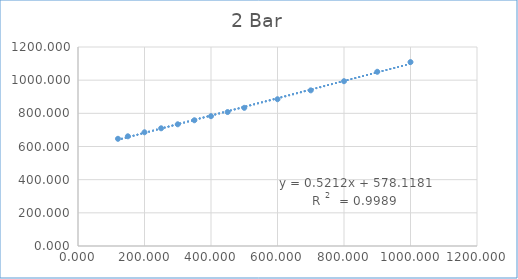
| Category | Series 0 |
|---|---|
| 120.2 | 646.488 |
| 150.0 | 661.515 |
| 200.0 | 685.786 |
| 250.0 | 709.795 |
| 300.0 | 733.899 |
| 350.0 | 758.218 |
| 400.0 | 782.848 |
| 450.0 | 807.836 |
| 500.0 | 833.182 |
| 600.0 | 885.045 |
| 700.0 | 938.557 |
| 800.0 | 993.741 |
| 900.0 | 1050.549 |
| 1000.0 | 1109.006 |